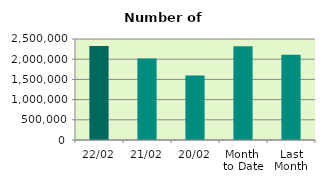
| Category | Series 0 |
|---|---|
| 22/02 | 2328398 |
| 21/02 | 2014842 |
| 20/02 | 1596322 |
| Month 
to Date | 2322237.25 |
| Last
Month | 2107310.455 |